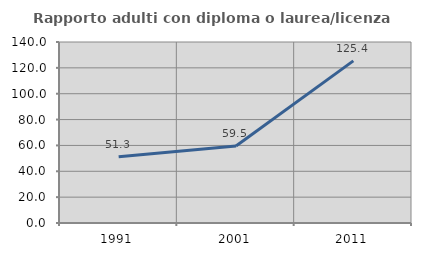
| Category | Rapporto adulti con diploma o laurea/licenza media  |
|---|---|
| 1991.0 | 51.287 |
| 2001.0 | 59.549 |
| 2011.0 | 125.397 |